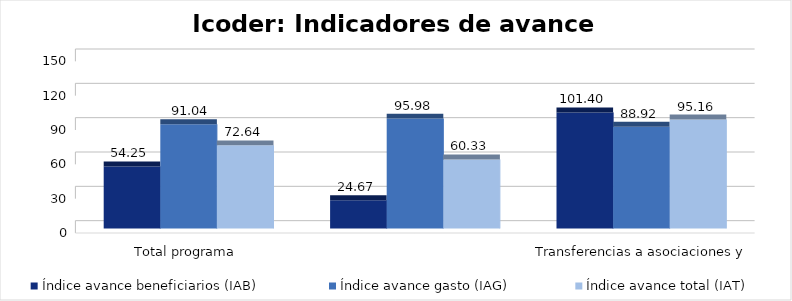
| Category | Índice avance beneficiarios (IAB)  | Índice avance gasto (IAG) | Índice avance total (IAT)  |
|---|---|---|---|
| Total programa | 54.246 | 91.042 | 72.644 |
| Transferencias a asociaciones y federaciones deportivas | 24.673 | 95.982 | 60.327 |
| Servicio de uso de parques e instalaciones deportivas | 101.405 | 88.925 | 95.165 |